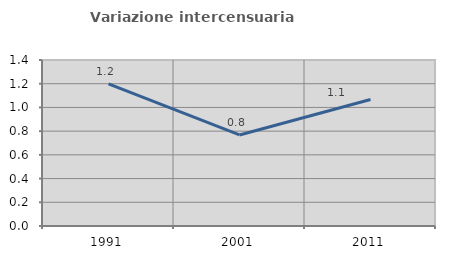
| Category | Variazione intercensuaria annua |
|---|---|
| 1991.0 | 1.198 |
| 2001.0 | 0.768 |
| 2011.0 | 1.066 |